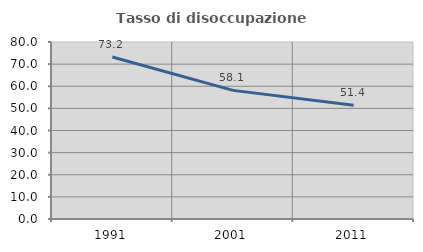
| Category | Tasso di disoccupazione giovanile  |
|---|---|
| 1991.0 | 73.188 |
| 2001.0 | 58.14 |
| 2011.0 | 51.429 |